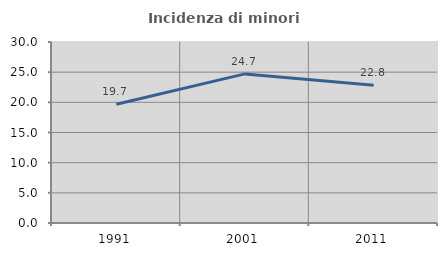
| Category | Incidenza di minori stranieri |
|---|---|
| 1991.0 | 19.672 |
| 2001.0 | 24.713 |
| 2011.0 | 22.812 |